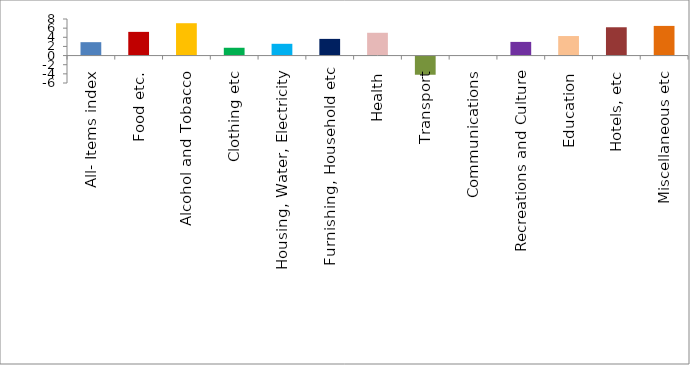
| Category | Series 0 |
|---|---|
| All- Items index | 2.93 |
| Food etc. | 5.184 |
| Alcohol and Tobacco | 7.078 |
| Clothing etc | 1.708 |
| Housing, Water, Electricity | 2.574 |
| Furnishing, Household etc | 3.65 |
| Health | 4.986 |
| Transport | -4.194 |
| Communications | 0.019 |
| Recreations and Culture | 2.99 |
| Education | 4.273 |
| Hotels, etc | 6.193 |
| Miscellaneous etc | 6.489 |